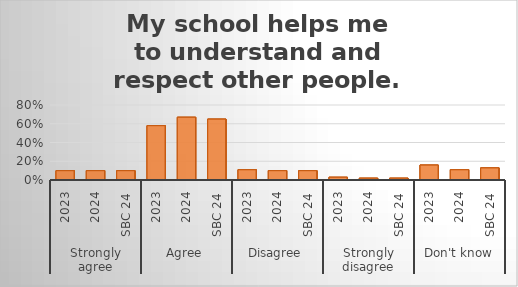
| Category | My school helps me to understand and respect other people. |
|---|---|
| 0 | 0.1 |
| 1 | 0.1 |
| 2 | 0.1 |
| 3 | 0.58 |
| 4 | 0.67 |
| 5 | 0.65 |
| 6 | 0.11 |
| 7 | 0.1 |
| 8 | 0.1 |
| 9 | 0.03 |
| 10 | 0.02 |
| 11 | 0.02 |
| 12 | 0.16 |
| 13 | 0.11 |
| 14 | 0.13 |